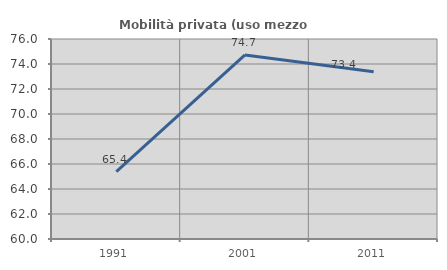
| Category | Mobilità privata (uso mezzo privato) |
|---|---|
| 1991.0 | 65.39 |
| 2001.0 | 74.723 |
| 2011.0 | 73.372 |